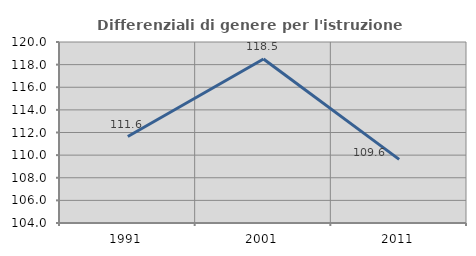
| Category | Differenziali di genere per l'istruzione superiore |
|---|---|
| 1991.0 | 111.644 |
| 2001.0 | 118.493 |
| 2011.0 | 109.621 |